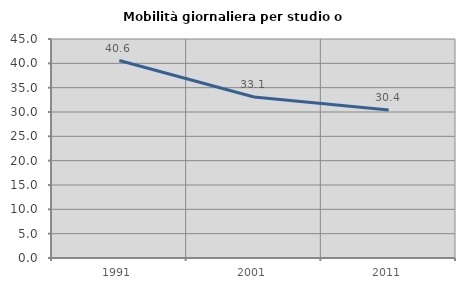
| Category | Mobilità giornaliera per studio o lavoro |
|---|---|
| 1991.0 | 40.574 |
| 2001.0 | 33.089 |
| 2011.0 | 30.393 |